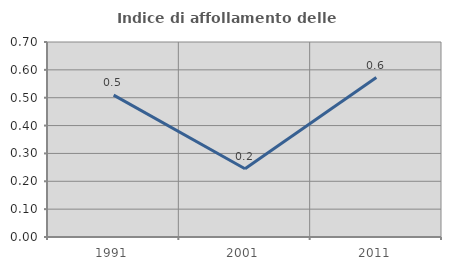
| Category | Indice di affollamento delle abitazioni  |
|---|---|
| 1991.0 | 0.509 |
| 2001.0 | 0.245 |
| 2011.0 | 0.573 |